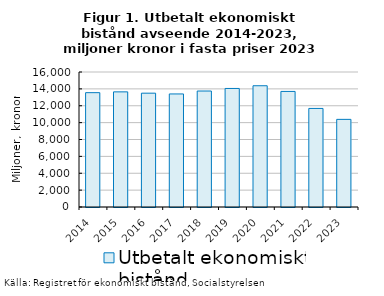
| Category | Utbetalt ekonomiskt bistånd |
|---|---|
| 2014.0 | 13550.106 |
| 2015.0 | 13646.059 |
| 2016.0 | 13490.015 |
| 2017.0 | 13399.47 |
| 2018.0 | 13745.977 |
| 2019.0 | 14049.435 |
| 2020.0 | 14371.45 |
| 2021.0 | 13696.609 |
| 2022.0 | 11682.107 |
| 2023.0 | 10386.788 |